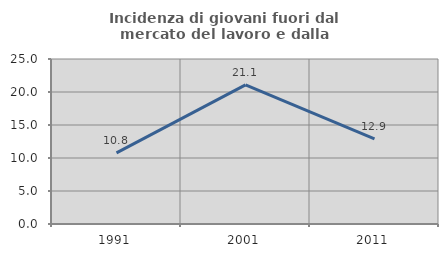
| Category | Incidenza di giovani fuori dal mercato del lavoro e dalla formazione  |
|---|---|
| 1991.0 | 10.777 |
| 2001.0 | 21.086 |
| 2011.0 | 12.895 |